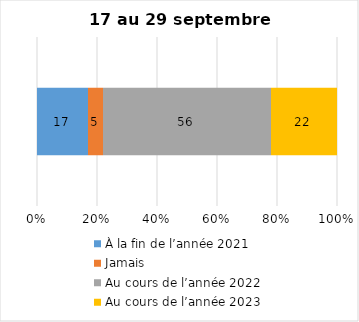
| Category | À la fin de l’année 2021 | Jamais | Au cours de l’année 2022 | Au cours de l’année 2023 |
|---|---|---|---|---|
| 0 | 17 | 5 | 56 | 22 |